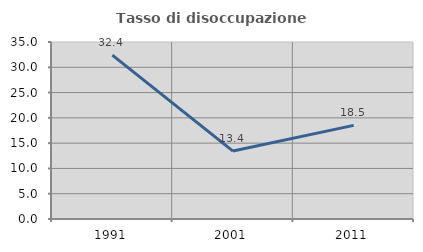
| Category | Tasso di disoccupazione giovanile  |
|---|---|
| 1991.0 | 32.407 |
| 2001.0 | 13.433 |
| 2011.0 | 18.519 |